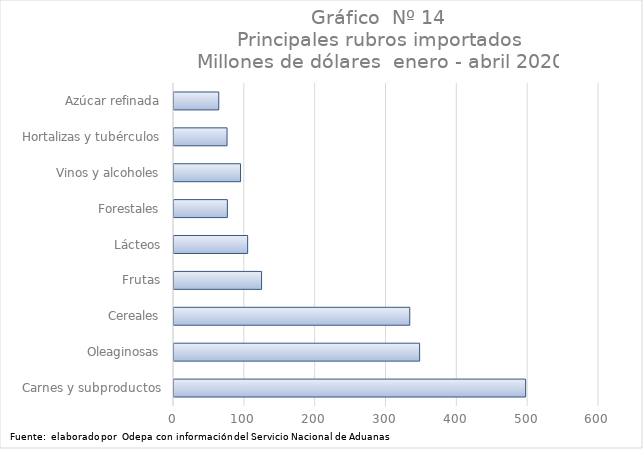
| Category | Series 0 |
|---|---|
| Carnes y subproductos | 496418.447 |
| Oleaginosas | 346756.878 |
| Cereales | 332825.61 |
| Frutas | 123645.304 |
| Lácteos | 103980.77 |
| Forestales | 75334 |
| Vinos y alcoholes | 93947.366 |
| Hortalizas y tubérculos | 74903.911 |
| Azúcar refinada | 63195.671 |